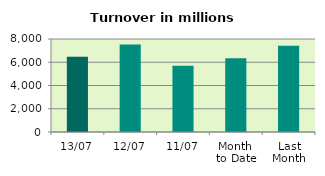
| Category | Series 0 |
|---|---|
| 13/07 | 6480.389 |
| 12/07 | 7526.937 |
| 11/07 | 5703.965 |
| Month 
to Date | 6342.944 |
| Last
Month | 7424.465 |